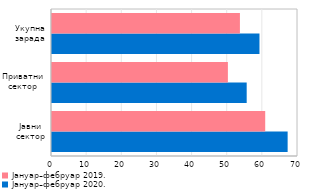
| Category | Јануар–фебруар 2020. | Јануар–фебруар 2019. |
|---|---|---|
| Јавни сектор | 67.05 | 60.67 |
| Приватни сектор | 55.401 | 50.051 |
| Укупна зарада | 59.036 | 53.474 |